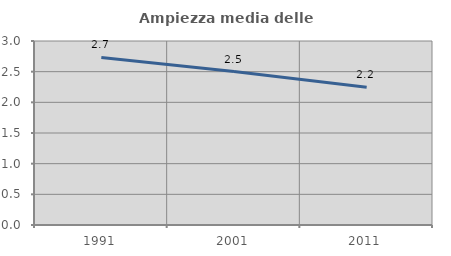
| Category | Ampiezza media delle famiglie |
|---|---|
| 1991.0 | 2.731 |
| 2001.0 | 2.501 |
| 2011.0 | 2.245 |